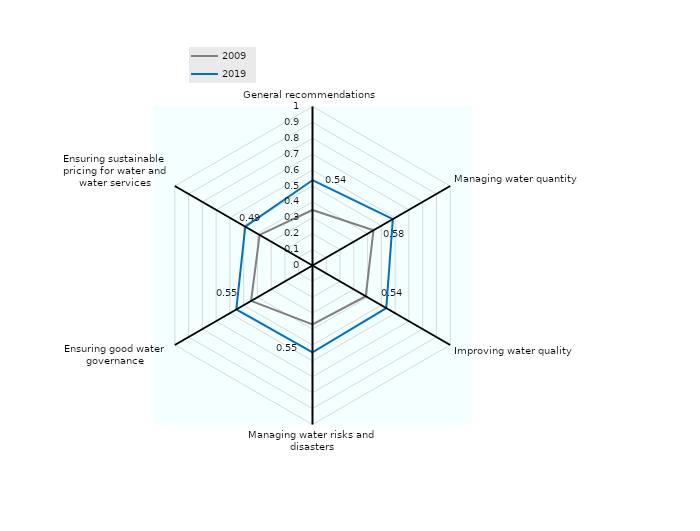
| Category | 2009 | 2019 |
|---|---|---|
| General recommendations | 0.349 | 0.536 |
| Managing water quantity  | 0.443 | 0.583 |
| Improving water quality | 0.387 | 0.536 |
| Managing water risks and disasters | 0.37 | 0.547 |
| Ensuring good water governance | 0.446 | 0.553 |
| Ensuring sustainable pricing for water and water services | 0.384 | 0.488 |